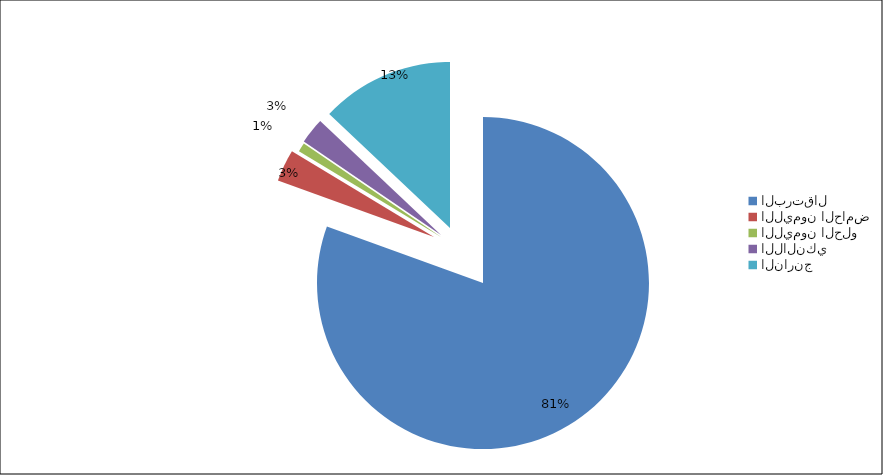
| Category | Series 0 |
|---|---|
| البرتقال | 133500 |
| الليمون الحامض | 5178 |
| الليمون الحلو | 1436 |
| اللالنكي | 4167 |
| النارنج | 21498 |